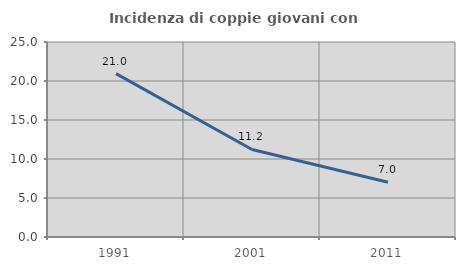
| Category | Incidenza di coppie giovani con figli |
|---|---|
| 1991.0 | 20.952 |
| 2001.0 | 11.224 |
| 2011.0 | 7.027 |